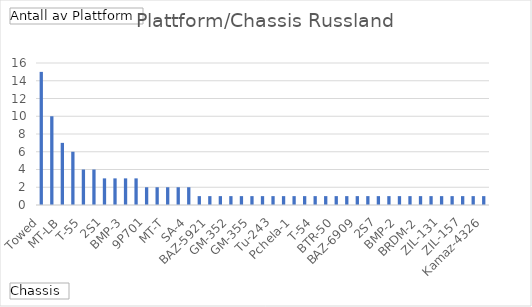
| Category | Totalt |
|---|---|
| Towed | 15 |
| T-72 | 10 |
| MT-LB | 7 |
| BMP-1 | 6 |
| T-55 | 4 |
| BTR-80 | 4 |
| 2S1 | 3 |
| T-90 | 3 |
| BMP-3 | 3 |
| GM-569 | 3 |
| 9P701 | 2 |
| T-80 | 2 |
| MT-T | 2 |
| T-64 | 2 |
| SA-4 | 2 |
| BTR-60 | 1 |
| BAZ-5921 | 1 |
| MT-12 | 1 |
| GM-352 | 1 |
| MZKT-7930 | 1 |
| GM-355 | 1 |
| BTR-70 | 1 |
| Tu-243 | 1 |
| BAZ-5937 | 1 |
| Pchela-1 | 1 |
| MZKT | 1 |
| T-54 | 1 |
| GAZ-2330 | 1 |
| BTR-50 | 1 |
| Ural 375-D | 1 |
| BAZ-6909 | 1 |
| ZIL-135LM | 1 |
| 2S7 | 1 |
|  GM-575 | 1 |
| BMP-2 | 1 |
| Kamaz-6396 | 1 |
| BRDM-2 | 1 |
| MAZ-543M | 1 |
| ZIL-131 | 1 |
| GMZ | 1 |
| ZIL-157 | 1 |
| IVECO | 1 |
| Kamaz-4326 | 1 |